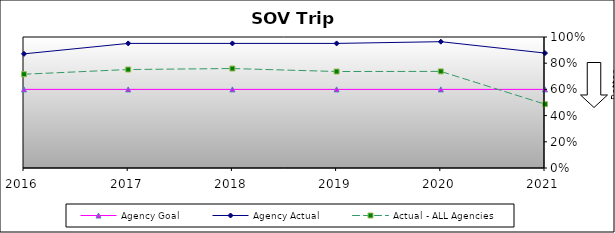
| Category | Agency Goal | Agency Actual | Actual - ALL Agencies |
|---|---|---|---|
| 2016.0 | 0.6 | 0.871 | 0.716 |
| 2017.0 | 0.6 | 0.951 | 0.752 |
| 2018.0 | 0.6 | 0.951 | 0.759 |
| 2019.0 | 0.6 | 0.951 | 0.736 |
| 2020.0 | 0.6 | 0.964 | 0.737 |
| 2021.0 | 0.6 | 0.877 | 0.487 |